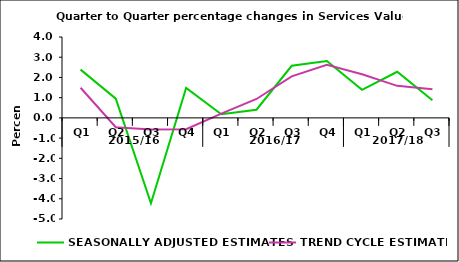
| Category | SEASONALLY ADJUSTED ESTIMATES | TREND CYCLE ESTIMATES |
|---|---|---|
| 0 | 2.387 | 1.49 |
| 1 | 0.953 | -0.464 |
| 2 | -4.225 | -0.573 |
| 3 | 1.485 | -0.56 |
| 4 | 0.181 | 0.212 |
| 5 | 0.403 | 0.935 |
| 6 | 2.578 | 2.054 |
| 7 | 2.815 | 2.621 |
| 8 | 1.39 | 2.157 |
| 9 | 2.281 | 1.584 |
| 10 | 0.869 | 1.415 |